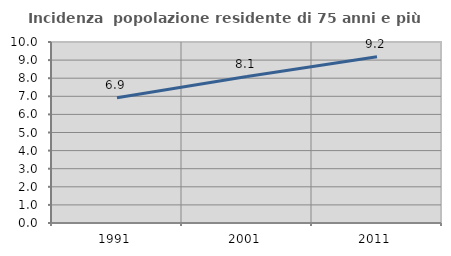
| Category | Incidenza  popolazione residente di 75 anni e più |
|---|---|
| 1991.0 | 6.924 |
| 2001.0 | 8.091 |
| 2011.0 | 9.182 |